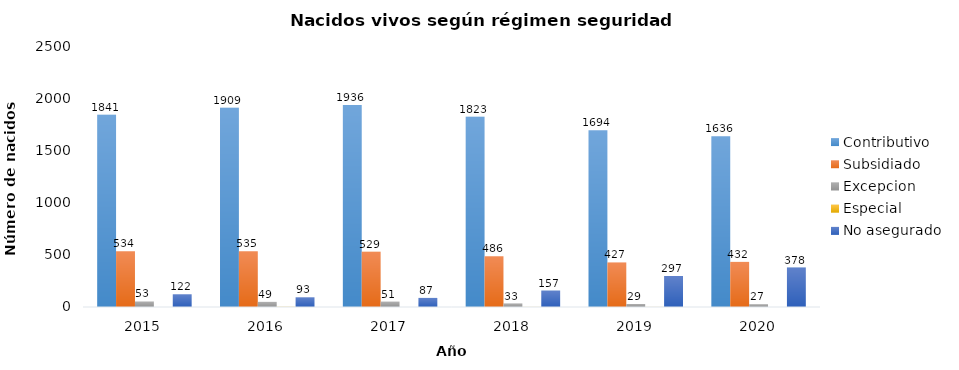
| Category | Contributivo | Subsidiado | Excepcion | Especial | No asegurado |
|---|---|---|---|---|---|
| 2015.0 | 1841 | 534 | 53 | 0 | 122 |
| 2016.0 | 1909 | 535 | 49 | 2 | 93 |
| 2017.0 | 1936 | 529 | 51 | 0 | 87 |
| 2018.0 | 1823 | 486 | 33 | 1 | 157 |
| 2019.0 | 1694 | 427 | 29 | 1 | 297 |
| 2020.0 | 1636 | 432 | 27 | 0 | 378 |